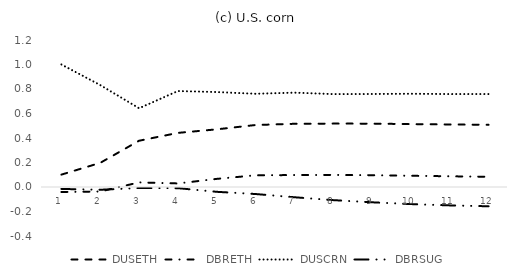
| Category | DUSETH | DBRETH | DUSCRN | DBRSUG |
|---|---|---|---|---|
| 0 | 0.101 | -0.041 | 1 | -0.016 |
| 1 | 0.197 | -0.037 | 0.832 | -0.023 |
| 2 | 0.378 | 0.038 | 0.643 | -0.008 |
| 3 | 0.442 | 0.029 | 0.783 | -0.01 |
| 4 | 0.471 | 0.066 | 0.775 | -0.039 |
| 5 | 0.506 | 0.095 | 0.761 | -0.057 |
| 6 | 0.516 | 0.098 | 0.77 | -0.084 |
| 7 | 0.518 | 0.098 | 0.758 | -0.107 |
| 8 | 0.517 | 0.096 | 0.759 | -0.125 |
| 9 | 0.514 | 0.091 | 0.761 | -0.139 |
| 10 | 0.511 | 0.088 | 0.759 | -0.15 |
| 11 | 0.508 | 0.084 | 0.759 | -0.157 |